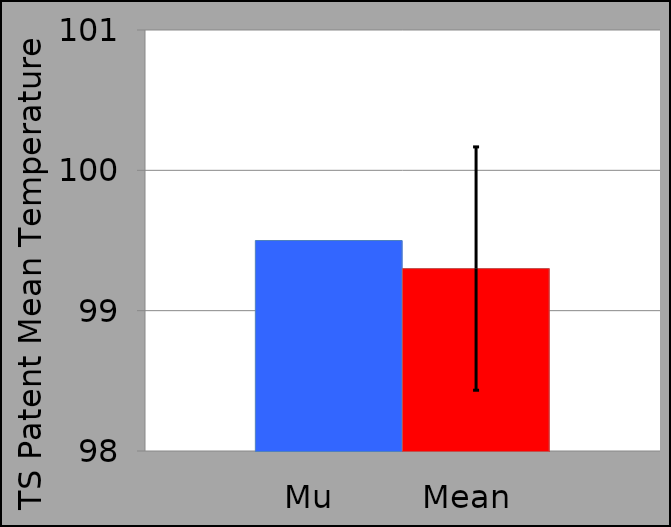
| Category | mu | M |
|---|---|---|
|  | 99.5 | 99.3 |